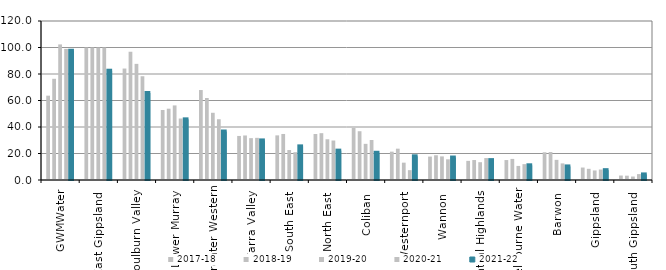
| Category | 2017-18 | 2018-19 | 2019-20 | 2020-21 | 2021-22 |
|---|---|---|---|---|---|
| GWMWater | 63.649 | 76.377 | 102.331 | 98.946 | 97.598 |
| East Gippsland  | 100 | 100 | 100 | 100 | 82.474 |
| Goulburn Valley  | 84.117 | 96.817 | 87.65 | 78.313 | 65.683 |
| Lower Murray  | 52.816 | 53.818 | 56.288 | 46.409 | 45.769 |
| Greater Western | 67.893 | 61.907 | 50.724 | 45.858 | 36.605 |
| Yarra Valley  | 33.245 | 33.607 | 31.588 | 31.811 | 29.872 |
| South East  | 33.684 | 34.743 | 22.613 | 20.97 | 25.374 |
| North East  | 34.702 | 35.333 | 30.741 | 29.796 | 22.165 |
| Coliban  | 39.282 | 36.811 | 27.279 | 30.211 | 20.544 |
| Westernport  | 21.397 | 23.64 | 13.085 | 7.441 | 17.879 |
| Wannon  | 17.677 | 18.678 | 17.807 | 15.62 | 16.964 |
| Central Highlands  | 14.439 | 15.067 | 13.434 | 16.556 | 15.009 |
| Melbourne Water | 15.05 | 15.916 | 10.626 | 11.971 | 11.094 |
| Barwon  | 20.921 | 21.093 | 15.202 | 12.523 | 10.241 |
| Gippsland  | 9.4 | 8.43 | 7.207 | 7.919 | 7.421 |
| South Gippsland  | 3.358 | 3.257 | 2.617 | 4.45 | 4.21 |